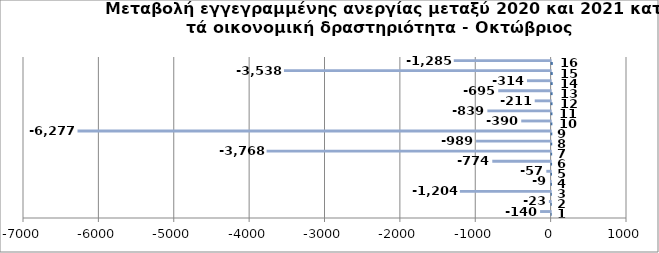
| Category | Series 0 | Series 1 |
|---|---|---|
| 0 | 1 | -140 |
| 1 | 2 | -23 |
| 2 | 3 | -1204 |
| 3 | 4 | -9 |
| 4 | 5 | -57 |
| 5 | 6 | -774 |
| 6 | 7 | -3768 |
| 7 | 8 | -989 |
| 8 | 9 | -6277 |
| 9 | 10 | -390 |
| 10 | 11 | -839 |
| 11 | 12 | -211 |
| 12 | 13 | -695 |
| 13 | 14 | -314 |
| 14 | 15 | -3538 |
| 15 | 16 | -1285 |